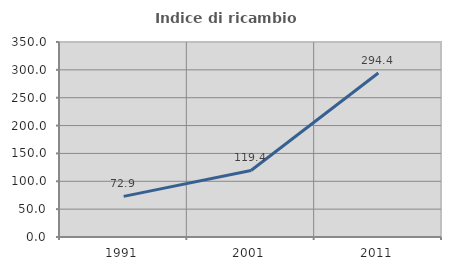
| Category | Indice di ricambio occupazionale  |
|---|---|
| 1991.0 | 72.866 |
| 2001.0 | 119.417 |
| 2011.0 | 294.41 |